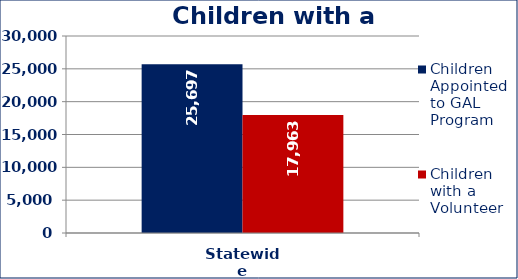
| Category | Children Appointed to GAL Program  | Children with a Volunteer  |
|---|---|---|
| Statewide | 25697 | 17963 |